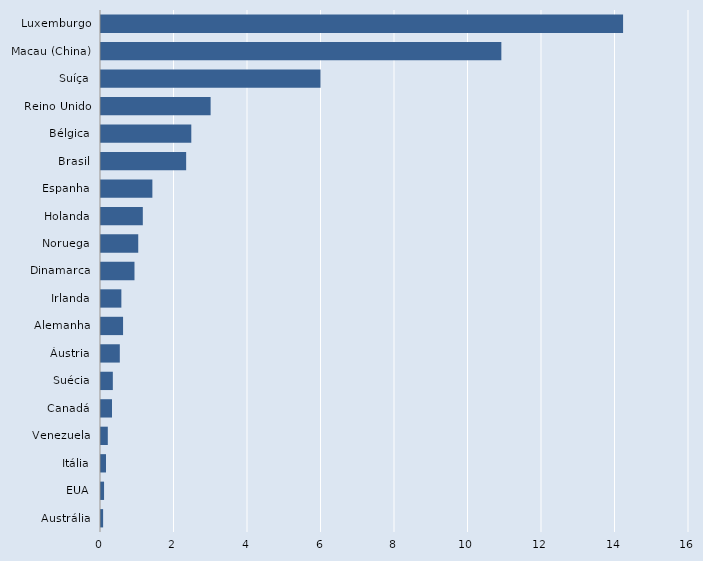
| Category | Series 0 |
|---|---|
| Austrália | 0.058 |
| EUA | 0.083 |
| Itália | 0.135 |
| Venezuela | 0.185 |
| Canadá | 0.3 |
| Suécia | 0.322 |
| Áustria | 0.512 |
| Alemanha | 0.6 |
| Irlanda | 0.554 |
| Dinamarca | 0.911 |
| Noruega | 1.013 |
| Holanda | 1.138 |
| Espanha | 1.398 |
| Brasil | 2.317 |
| Bélgica | 2.457 |
| Reino Unido | 2.983 |
| Suíça | 5.974 |
| Macau (China) | 10.894 |
| Luxemburgo | 14.206 |